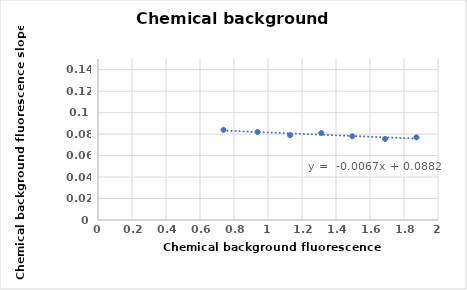
| Category | Series 0 |
|---|---|
| 0.7384 | 0.084 |
| 0.939 | 0.082 |
| 1.1299 | 0.079 |
| 1.3135 | 0.081 |
| 1.4959 | 0.078 |
| 1.6887 | 0.076 |
| 1.873 | 0.077 |